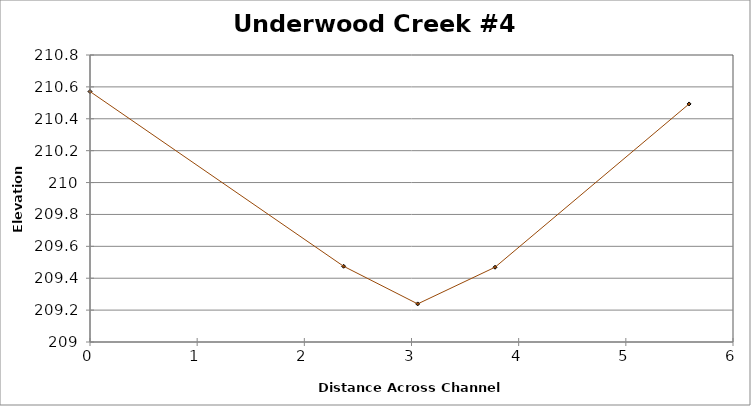
| Category | Series 0 |
|---|---|
| 0.0 | 210.571 |
| 2.3662734413140694 | 209.475 |
| 3.05761115934439 | 209.239 |
| 3.779518752325202 | 209.469 |
| 5.590172537434867 | 210.493 |